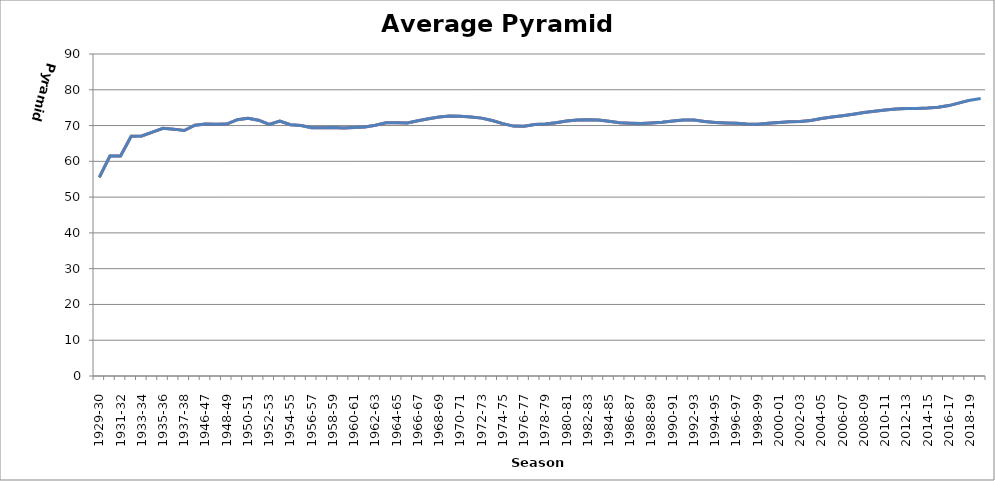
| Category | Series 1 | Series 0 |
|---|---|---|
| 1929-30 | 55.5 | 55.5 |
| 1930-31 | 61.5 | 61.5 |
| 1931-32 | 61.5 | 61.5 |
| 1932-33 | 67 | 67 |
| 1933-34 | 67.1 | 67.1 |
| 1934-35 | 68.167 | 68.167 |
| 1935-36 | 69.214 | 69.214 |
| 1936-37 | 69 | 69 |
| 1937-38 | 68.611 | 68.611 |
| 1938-39 | 70.1 | 70.1 |
| 1946-47 | 70.409 | 70.409 |
| 1947-48 | 70.333 | 70.333 |
| 1948-49 | 70.423 | 70.423 |
| 1949-50 | 71.643 | 71.643 |
| 1950-51 | 72.033 | 72.033 |
| 1951-52 | 71.5 | 71.5 |
| 1952-53 | 70.324 | 70.324 |
| 1953-54 | 71.278 | 71.278 |
| 1954-55 | 70.237 | 70.237 |
| 1955-56 | 70 | 70 |
| 1956-57 | 69.405 | 69.405 |
| 1957-58 | 69.409 | 69.409 |
| 1958-59 | 69.478 | 69.478 |
| 1959-60 | 69.292 | 69.292 |
| 1960-61 | 69.44 | 69.44 |
| 1961-62 | 69.615 | 69.615 |
| 1962-63 | 70.074 | 70.074 |
| 1963-64 | 70.786 | 70.786 |
| 1964-65 | 70.793 | 70.793 |
| 1965-66 | 70.7 | 70.7 |
| 1966-67 | 71.323 | 71.323 |
| 1967-68 | 71.875 | 71.875 |
| 1968-69 | 72.394 | 72.394 |
| 1969-70 | 72.647 | 72.647 |
| 1970-71 | 72.629 | 72.629 |
| 1971-72 | 72.361 | 72.361 |
| 1972-73 | 72.081 | 72.081 |
| 1973-74 | 71.421 | 71.421 |
| 1974-75 | 70.538 | 70.538 |
| 1975-76 | 69.85 | 69.85 |
| 1976-77 | 69.805 | 69.805 |
| 1977-78 | 70.286 | 70.286 |
| 1978-79 | 70.465 | 70.465 |
| 1979-80 | 70.795 | 70.795 |
| 1980-81 | 71.267 | 71.267 |
| 1981-82 | 71.565 | 71.565 |
| 1982-83 | 71.638 | 71.638 |
| 1983-84 | 71.583 | 71.583 |
| 1984-85 | 71.184 | 71.184 |
| 1985-86 | 70.78 | 70.78 |
| 1986-87 | 70.647 | 70.647 |
| 1987-88 | 70.577 | 70.577 |
| 1988-89 | 70.736 | 70.736 |
| 1989-90 | 70.926 | 70.926 |
| 1990-91 | 71.255 | 71.255 |
| 1991-92 | 71.536 | 71.536 |
| 1992-93 | 71.544 | 71.544 |
| 1993-94 | 71.155 | 71.155 |
| 1994-95 | 70.847 | 70.847 |
| 1995-96 | 70.733 | 70.733 |
| 1996-97 | 70.623 | 70.623 |
| 1997-98 | 70.452 | 70.452 |
| 1998-99 | 70.365 | 70.365 |
| 1999-00 | 70.641 | 70.641 |
| 2000-01 | 70.862 | 70.862 |
| 2001-02 | 71.03 | 71.03 |
| 2002-03 | 71.134 | 71.134 |
| 2003-04 | 71.441 | 71.441 |
| 2004-05 | 71.986 | 71.986 |
| 2005-06 | 72.386 | 72.386 |
| 2006-07 | 72.718 | 72.718 |
| 2007-08 | 73.181 | 73.181 |
| 2008-09 | 73.671 | 73.671 |
| 2009-10 | 73.986 | 73.986 |
| 2010-11 | 74.333 | 74.333 |
| 2011-12 | 74.618 | 74.618 |
| 2012-13 | 74.753 | 74.753 |
| 2013-14 | 74.756 | 74.756 |
| 2014-15 | 74.899 | 74.899 |
| 2015-16 | 75.112 | 75.112 |
| 2016-17 | 75.58 | 75.58 |
| 2017-18 | 76.335 | 76.335 |
| 2018-19 | 77.096 | 77.096 |